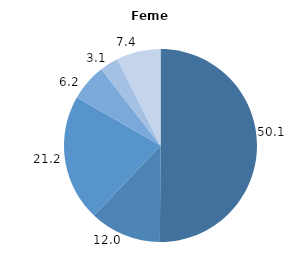
| Category | Series 0 |
|---|---|
| 0 | 50.1 |
| 1 | 12 |
| 2 | 21.2 |
| 3 | 6.2 |
| 4 | 3.1 |
| 5 | 7.4 |